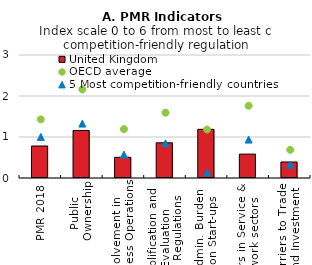
| Category | United Kingdom |
|---|---|
| PMR 2018 | 0.78 |
| Public 
Ownership | 1.159 |
| Involvement in 
Business Operations | 0.505 |
| Simplification and 
Evaluation 
of Regulations | 0.858 |
| Admin. Burden  
on Start-ups  | 1.188 |
| Barriers in Service & 
Network sectors | 0.582 |
| Barriers to Trade 
and Investment | 0.391 |